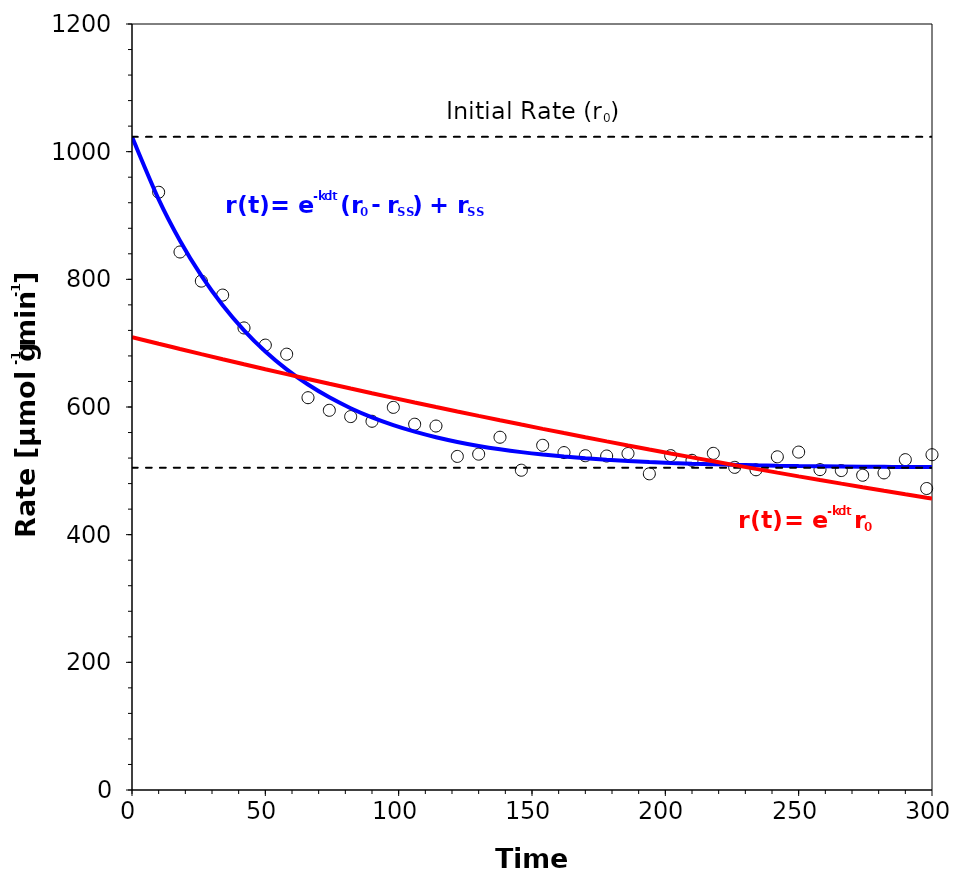
| Category | Series 0 |
|---|---|
| 10.0 | 936.365 |
| 18.0 | 842.838 |
| 26.0 | 797.26 |
| 34.0 | 775.308 |
| 42.0 | 723.855 |
| 50.0 | 696.94 |
| 58.0 | 682.743 |
| 66.0 | 614.568 |
| 74.0 | 594.819 |
| 82.0 | 584.99 |
| 90.0 | 577.649 |
| 98.0 | 599.429 |
| 106.0 | 573.016 |
| 114.0 | 570.142 |
| 122.0 | 522.58 |
| 130.0 | 526.137 |
| 138.0 | 552.646 |
| 146.0 | 500.967 |
| 154.0 | 539.98 |
| 162.0 | 528.582 |
| 170.0 | 523.687 |
| 178.0 | 523.219 |
| 186.0 | 527.117 |
| 194.0 | 495.325 |
| 202.0 | 523.799 |
| 210.0 | 516.498 |
| 218.0 | 527.389 |
| 226.0 | 505.445 |
| 234.0 | 501.64 |
| 242.0 | 521.954 |
| 250.0 | 529.369 |
| 258.0 | 501.871 |
| 266.0 | 500.446 |
| 274.0 | 493.085 |
| 282.0 | 496.776 |
| 290.0 | 517.514 |
| 298.0 | 472.29 |
| 300.0 | 525.239 |